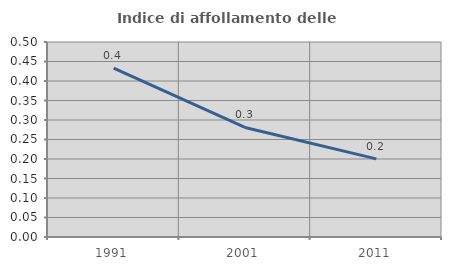
| Category | Indice di affollamento delle abitazioni  |
|---|---|
| 1991.0 | 0.433 |
| 2001.0 | 0.281 |
| 2011.0 | 0.2 |